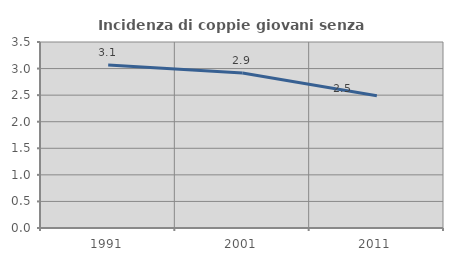
| Category | Incidenza di coppie giovani senza figli |
|---|---|
| 1991.0 | 3.066 |
| 2001.0 | 2.918 |
| 2011.0 | 2.487 |